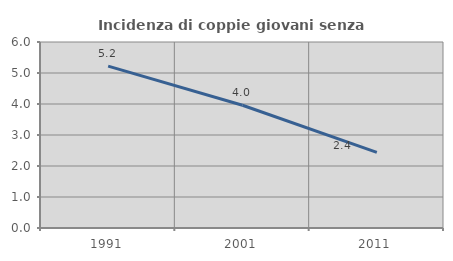
| Category | Incidenza di coppie giovani senza figli |
|---|---|
| 1991.0 | 5.223 |
| 2001.0 | 3.96 |
| 2011.0 | 2.441 |